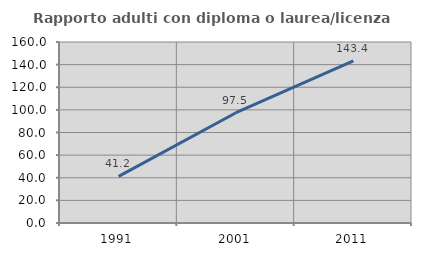
| Category | Rapporto adulti con diploma o laurea/licenza media  |
|---|---|
| 1991.0 | 41.176 |
| 2001.0 | 97.468 |
| 2011.0 | 143.421 |